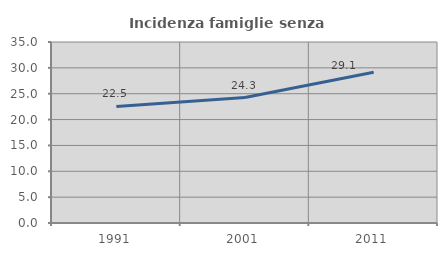
| Category | Incidenza famiglie senza nuclei |
|---|---|
| 1991.0 | 22.536 |
| 2001.0 | 24.26 |
| 2011.0 | 29.149 |